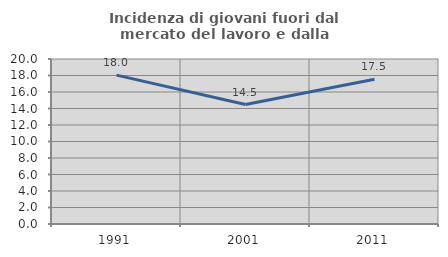
| Category | Incidenza di giovani fuori dal mercato del lavoro e dalla formazione  |
|---|---|
| 1991.0 | 18.041 |
| 2001.0 | 14.477 |
| 2011.0 | 17.534 |